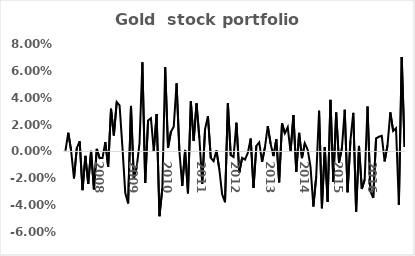
| Category | Series 0 |
|---|---|
| nan | 0 |
| nan | 0.014 |
| nan | 0.001 |
| nan | -0.02 |
| nan | 0.002 |
| nan | 0.008 |
| nan | -0.029 |
| nan | -0.003 |
| nan | -0.024 |
| nan | 0 |
| nan | -0.028 |
| nan | 0.002 |
| 2008.0 | -0.005 |
| nan | -0.005 |
| nan | 0.007 |
| nan | -0.012 |
| nan | 0.032 |
| nan | 0.012 |
| nan | 0.037 |
| nan | 0.034 |
| nan | 0.003 |
| nan | -0.031 |
| nan | -0.039 |
| nan | 0.034 |
| 2009.0 | -0.02 |
| nan | -0.012 |
| nan | 0.006 |
| nan | 0.066 |
| nan | -0.023 |
| nan | 0.023 |
| nan | 0.025 |
| nan | 0 |
| nan | 0.028 |
| nan | -0.048 |
| nan | -0.028 |
| nan | 0.063 |
| 2010.0 | 0.003 |
| nan | 0.014 |
| nan | 0.018 |
| nan | 0.051 |
| nan | 0 |
| nan | -0.026 |
| nan | 0.001 |
| nan | -0.031 |
| nan | 0.037 |
| nan | 0.008 |
| nan | 0.036 |
| nan | 0.01 |
| 2011.0 | -0.024 |
| nan | 0.017 |
| nan | 0.026 |
| nan | -0.005 |
| nan | -0.007 |
| nan | 0.001 |
| nan | -0.013 |
| nan | -0.032 |
| nan | -0.038 |
| nan | 0.036 |
| nan | -0.003 |
| nan | -0.004 |
| 2012.0 | 0.021 |
| nan | -0.016 |
| nan | -0.005 |
| nan | -0.006 |
| nan | -0.001 |
| nan | 0.01 |
| nan | -0.027 |
| nan | 0.004 |
| nan | 0.007 |
| nan | -0.008 |
| nan | 0.003 |
| nan | 0.019 |
| 2013.0 | 0.006 |
| nan | -0.004 |
| nan | 0.009 |
| nan | -0.023 |
| nan | 0.021 |
| nan | 0.014 |
| nan | 0.018 |
| nan | 0 |
| nan | 0.027 |
| nan | -0.015 |
| nan | 0.014 |
| nan | -0.005 |
| 2014.0 | 0.006 |
| nan | 0.001 |
| nan | -0.012 |
| nan | -0.041 |
| nan | -0.019 |
| nan | 0.03 |
| nan | -0.042 |
| nan | 0.003 |
| nan | -0.038 |
| nan | 0.038 |
| nan | -0.023 |
| nan | 0.029 |
| 2015.0 | -0.008 |
| nan | 0.002 |
| nan | 0.031 |
| nan | -0.03 |
| nan | 0.008 |
| nan | 0.029 |
| nan | -0.045 |
| nan | 0.004 |
| nan | -0.028 |
| nan | -0.021 |
| nan | 0.033 |
| nan | -0.03 |
| 2016.0 | -0.035 |
| nan | 0.01 |
| nan | 0.011 |
| nan | 0.012 |
| nan | -0.007 |
| nan | 0.004 |
| nan | 0.029 |
| nan | 0.015 |
| nan | 0.017 |
| nan | -0.04 |
| nan | 0.07 |
| nan | 0.003 |